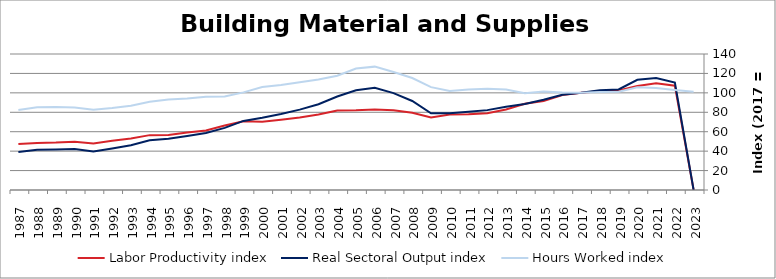
| Category | Labor Productivity index | Real Sectoral Output index | Hours Worked index |
|---|---|---|---|
| 2023.0 | 0 | 0 | 101.026 |
| 2022.0 | 107.353 | 110.554 | 102.982 |
| 2021.0 | 109.761 | 115.292 | 105.039 |
| 2020.0 | 107.141 | 113.428 | 105.868 |
| 2019.0 | 102.411 | 103.551 | 101.113 |
| 2018.0 | 101.582 | 102.591 | 100.993 |
| 2017.0 | 100 | 100 | 100 |
| 2016.0 | 97.671 | 98.122 | 100.462 |
| 2015.0 | 91.571 | 92.919 | 101.472 |
| 2014.0 | 88.848 | 88.573 | 99.69 |
| 2013.0 | 82.817 | 85.688 | 103.468 |
| 2012.0 | 78.923 | 82.219 | 104.176 |
| 2011.0 | 77.977 | 80.66 | 103.441 |
| 2010.0 | 77.602 | 79.116 | 101.951 |
| 2009.0 | 74.577 | 78.991 | 105.919 |
| 2008.0 | 79.503 | 91.661 | 115.293 |
| 2007.0 | 82.144 | 99.776 | 121.465 |
| 2006.0 | 82.887 | 105.263 | 126.995 |
| 2005.0 | 82.02 | 102.591 | 125.081 |
| 2004.0 | 81.829 | 96.255 | 117.63 |
| 2003.0 | 77.648 | 88.339 | 113.769 |
| 2002.0 | 74.597 | 82.744 | 110.921 |
| 2001.0 | 72.318 | 78.18 | 108.107 |
| 2000.0 | 70.188 | 74.426 | 106.037 |
| 1999.0 | 70.747 | 71.114 | 100.519 |
| 1998.0 | 66.421 | 63.912 | 96.223 |
| 1997.0 | 61.221 | 58.766 | 95.99 |
| 1996.0 | 59.194 | 55.684 | 94.071 |
| 1995.0 | 56.683 | 52.749 | 93.059 |
| 1994.0 | 56.483 | 51.292 | 90.81 |
| 1993.0 | 53.111 | 46.107 | 86.814 |
| 1992.0 | 50.593 | 42.656 | 84.311 |
| 1991.0 | 47.859 | 39.542 | 82.621 |
| 1990.0 | 49.752 | 42.242 | 84.905 |
| 1989.0 | 48.772 | 41.65 | 85.398 |
| 1988.0 | 48.505 | 41.363 | 85.277 |
| 1987.0 | 47.421 | 39.006 | 82.255 |